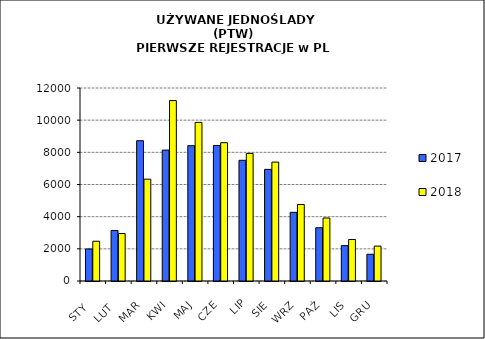
| Category | 2017 | 2018 |
|---|---|---|
|  STY  | 1992 | 2472 |
|  LUT  | 3141 | 2952 |
| MAR | 8723 | 6331 |
| KWI | 8140 | 11217 |
| MAJ | 8414 | 9861 |
| CZE | 8425 | 8599 |
| LIP | 7505 | 7934 |
| SIE | 6941 | 7394 |
| WRZ | 4268 | 4757 |
| PAŹ | 3312 | 3918 |
| LIS | 2200 | 2582 |
| GRU | 1663 | 2170 |